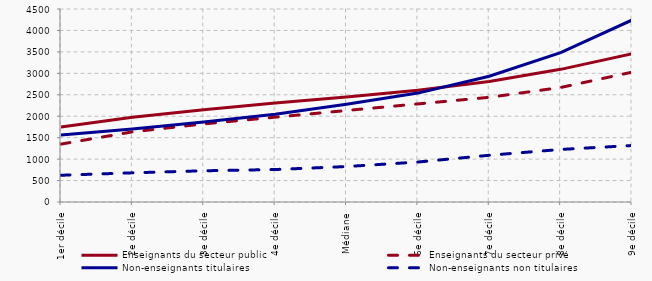
| Category | Enseignants du secteur public | Enseignants du secteur privé | Non-enseignants titulaires | Non-enseignants non titulaires |
|---|---|---|---|---|
| 1er décile | 1747.583 | 1350.108 | 1560.583 | 623.5 |
| 2e décile | 1976.917 | 1635 | 1703.833 | 680.083 |
| 3e décile | 2151.562 | 1820.583 | 1863.871 | 727.997 |
| 4e décile | 2309.5 | 1977.833 | 2045.292 | 756.926 |
| Médiane | 2448.045 | 2133.417 | 2278.667 | 826.75 |
| 6e décile | 2606.846 | 2287.236 | 2539.25 | 932 |
| 7e décile | 2811.562 | 2440.833 | 2932.568 | 1089.643 |
| 8e décile | 3093.083 | 2669.673 | 3484.208 | 1225.333 |
| 9e décile | 3457.568 | 3026.947 | 4242.208 | 1316.553 |